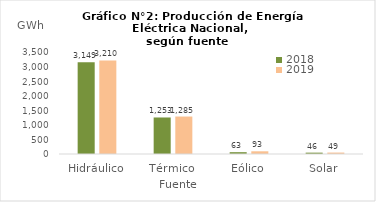
| Category | 2018 | 2019 |
|---|---|---|
| Hidráulico | 3148.548 | 3209.789 |
| Térmico | 1253.117 | 1285.265 |
| Eólico | 62.565 | 92.625 |
| Solar | 46.187 | 49.242 |